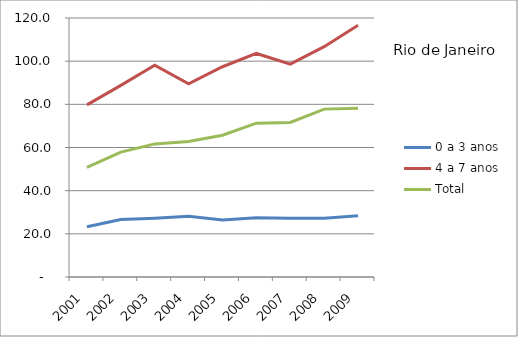
| Category | 0 a 3 anos | 4 a 7 anos | Total |
|---|---|---|---|
| 2001.0 | 23.27 | 79.74 | 50.84 |
| 2002.0 | 26.61 | 88.78 | 57.85 |
| 2003.0 | 27.24 | 98.11 | 61.66 |
| 2004.0 | 28.09 | 89.55 | 62.74 |
| 2005.0 | 26.4 | 97.42 | 65.69 |
| 2006.0 | 27.49 | 103.57 | 71.29 |
| 2007.0 | 27.18 | 98.66 | 71.59 |
| 2008.0 | 27.17 | 106.7 | 77.78 |
| 2009.0 | 28.38 | 116.65 | 78.23 |